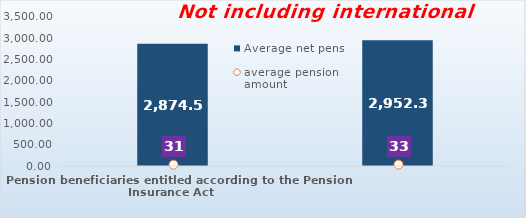
| Category | Average net pension  |
|---|---|
| Pension beneficiaries entitled according to the Pension Insurance Act   | 2874.55 |
| Pension beneficiaries entitled to pension FOR THE FIRST TIME in 2020 according to the Pension Insurance Act  - NEW BENEFICIARIES | 2952.36 |